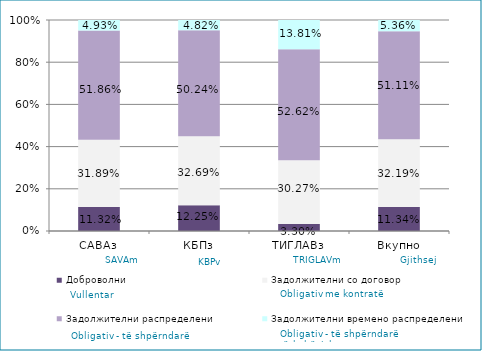
| Category | Доброволни  | Задолжителни со договор  | Задолжителни распределени  | Задолжителни времено распределени  |
|---|---|---|---|---|
| САВАз | 0.113 | 0.319 | 0.519 | 0.049 |
| КБПз | 0.123 | 0.327 | 0.502 | 0.048 |
| ТИГЛАВз | 0.033 | 0.303 | 0.526 | 0.138 |
| Вкупно | 0.113 | 0.322 | 0.511 | 0.054 |